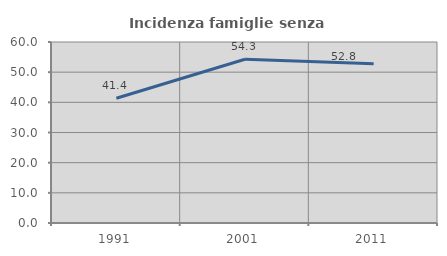
| Category | Incidenza famiglie senza nuclei |
|---|---|
| 1991.0 | 41.356 |
| 2001.0 | 54.268 |
| 2011.0 | 52.805 |